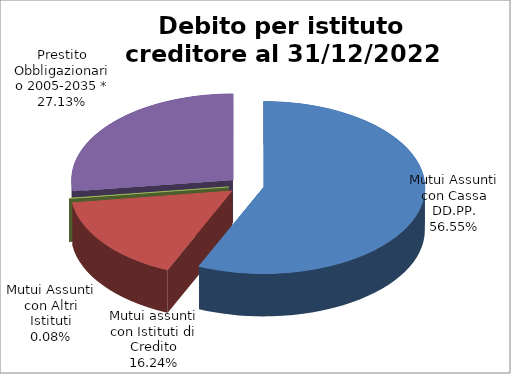
| Category | Series 2 |
|---|---|
| Mutui Assunti con Cassa DD.PP. | 2036.18 |
| Mutui assunti con Istituti di Credito | 584.578 |
| Mutui Assunti con Altri Istituti | 2.866 |
| Prestito Obbligazionario 2005-2035 * | 976.922 |